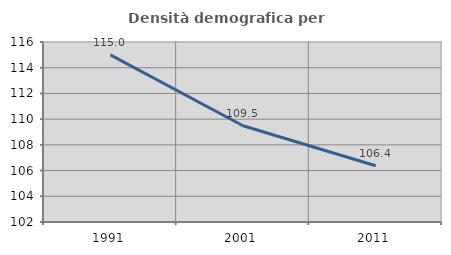
| Category | Densità demografica |
|---|---|
| 1991.0 | 114.998 |
| 2001.0 | 109.484 |
| 2011.0 | 106.371 |